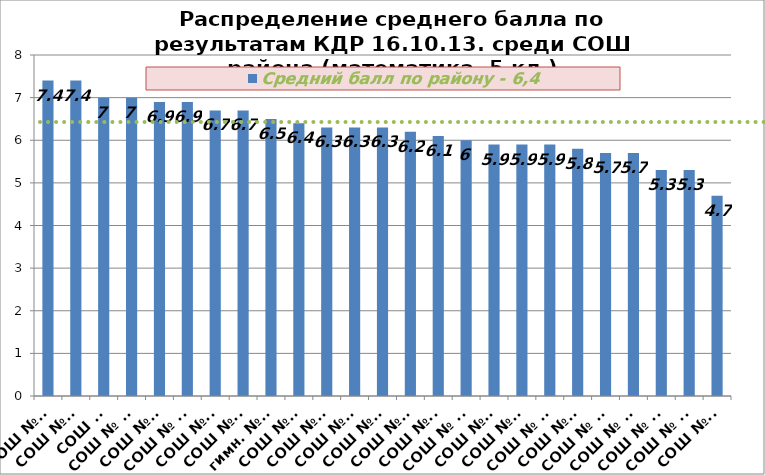
| Category | Средний балл по району - 6,4 |
|---|---|
| СОШ № 2 | 7.4 |
| СОШ №10 | 7.4 |
| СОШ №1 | 7 |
| СОШ № 23 | 7 |
| СОШ № 4 | 6.9 |
| СОШ № 19 | 6.9 |
| СОШ № 6 | 6.7 |
| СОШ №15 | 6.7 |
| гимн. № 5 | 6.5 |
| СОШ № 3 | 6.4 |
| СОШ № 7 | 6.3 |
| СОШ №14 | 6.3 |
| СОШ №36 | 6.3 |
| СОШ №17 | 6.2 |
| СОШ № 9 | 6.1 |
| СОШ № 11 | 6 |
| СОШ №12 | 5.9 |
| СОШ №16 | 5.9 |
| СОШ № 22 | 5.9 |
| СОШ №20 | 5.8 |
| СОШ № 18 | 5.7 |
| СОШ № 25 | 5.7 |
| СОШ № 13 | 5.3 |
| СОШ № 24 | 5.3 |
| СОШ № 8 | 4.7 |